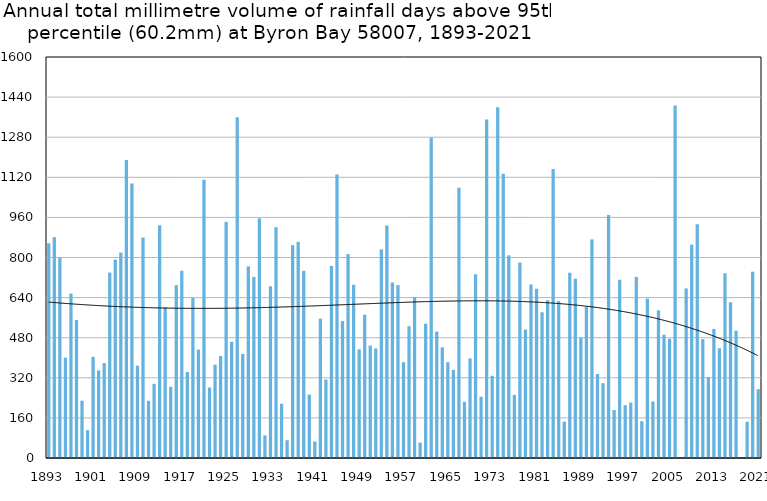
| Category | Annual total mm in days above 95th percentile |
|---|---|
| 1893 | 857 |
| 1894 | 881.1 |
| 1895 | 798.6 |
| 1896 | 400.1 |
| 1897 | 656.1 |
| 1898 | 550.2 |
| 1899 | 228.7 |
| 1900 | 111 |
| 1901 | 403.4 |
| 1902 | 349.4 |
| 1903 | 378.7 |
| 1904 | 739.8 |
| 1905 | 791.6 |
| 1906 | 819.7 |
| 1907 | 1189.2 |
| 1908 | 1095.2 |
| 1909 | 368.5 |
| 1910 | 879.6 |
| 1911 | 228.1 |
| 1912 | 296 |
| 1913 | 929.1 |
| 1914 | 601.5 |
| 1915 | 284 |
| 1916 | 689.7 |
| 1917 | 747.3 |
| 1918 | 343.3 |
| 1919 | 639.5 |
| 1920 | 432.1 |
| 1921 | 1109.9 |
| 1922 | 281.2 |
| 1923 | 372.2 |
| 1924 | 406.9 |
| 1925 | 942.1 |
| 1926 | 463.5 |
| 1927 | 1359.5 |
| 1928 | 415.5 |
| 1929 | 764.5 |
| 1930 | 722.5 |
| 1931 | 956.8 |
| 1932 | 90.4 |
| 1933 | 685.7 |
| 1934 | 921.2 |
| 1935 | 216.6 |
| 1936 | 71.1 |
| 1937 | 849.4 |
| 1938 | 862.5 |
| 1939 | 747 |
| 1940 | 253 |
| 1941 | 66.3 |
| 1942 | 556 |
| 1943 | 313.2 |
| 1944 | 765.8 |
| 1945 | 1131.2 |
| 1946 | 546.4 |
| 1947 | 813.6 |
| 1948 | 691.6 |
| 1949 | 433.6 |
| 1950 | 571.7 |
| 1951 | 448.6 |
| 1952 | 437.5 |
| 1953 | 832.4 |
| 1954 | 928.1 |
| 1955 | 700.5 |
| 1956 | 690.1 |
| 1957 | 382.3 |
| 1958 | 525.9 |
| 1959 | 640.9 |
| 1960 | 61.5 |
| 1961 | 535.7 |
| 1962 | 1278.8 |
| 1963 | 504.5 |
| 1964 | 441.7 |
| 1965 | 382.3 |
| 1966 | 351.7 |
| 1967 | 1078.8 |
| 1968 | 224 |
| 1969 | 397.2 |
| 1970 | 733.5 |
| 1971 | 244.3 |
| 1972 | 1351 |
| 1973 | 327.9 |
| 1974 | 1399.2 |
| 1975 | 1134.1 |
| 1976 | 808.8 |
| 1977 | 251.8 |
| 1978 | 780.2 |
| 1979 | 512.4 |
| 1980 | 692.4 |
| 1981 | 674.9 |
| 1982 | 581.4 |
| 1983 | 629.4 |
| 1984 | 1153.6 |
| 1985 | 626 |
| 1986 | 145.2 |
| 1987 | 739.1 |
| 1988 | 715.6 |
| 1989 | 480.1 |
| 1990 | 603 |
| 1991 | 872.4 |
| 1992 | 335.1 |
| 1993 | 298.3 |
| 1994 | 969.4 |
| 1995 | 191.6 |
| 1996 | 711.3 |
| 1997 | 210.8 |
| 1998 | 221.2 |
| 1999 | 722.6 |
| 2000 | 146.6 |
| 2001 | 636.2 |
| 2002 | 225.6 |
| 2003 | 589.4 |
| 2004 | 492 |
| 2005 | 475.6 |
| 2006 | 1406.4 |
| 2007 | 0 |
| 2008 | 676.6 |
| 2009 | 851.6 |
| 2010 | 932.6 |
| 2011 | 474 |
| 2012 | 323.2 |
| 2013 | 515 |
| 2014 | 437.8 |
| 2015 | 736.8 |
| 2016 | 621.6 |
| 2017 | 508.2 |
| 2018 | 0 |
| 2019 | 144.4 |
| 2020 | 743.4 |
| 2021 | 274.6 |